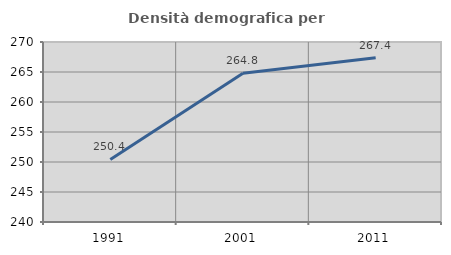
| Category | Densità demografica |
|---|---|
| 1991.0 | 250.435 |
| 2001.0 | 264.778 |
| 2011.0 | 267.356 |